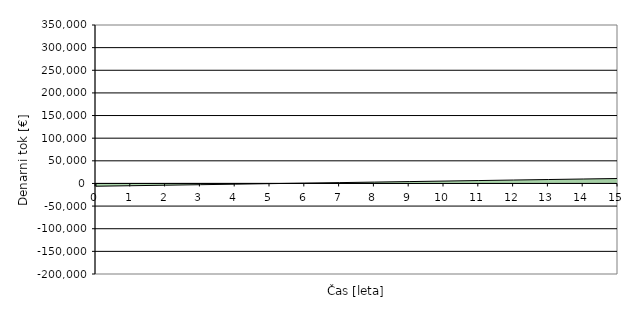
| Category | Series 0 |
|---|---|
| 0.0 | -6150 |
| 1.0 | -5008.893 |
| 2.0 | -3867.787 |
| 3.0 | -2726.68 |
| 4.0 | -1585.574 |
| 5.0 | -444.467 |
| 6.0 | 696.64 |
| 7.0 | 1837.746 |
| 8.0 | 2978.853 |
| 9.0 | 4119.96 |
| 10.0 | 5261.066 |
| 11.0 | 6402.173 |
| 12.0 | 7543.279 |
| 13.0 | 8684.386 |
| 14.0 | 9825.493 |
| 15.0 | 10966.599 |